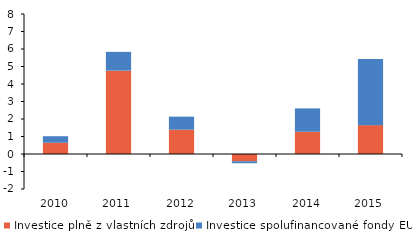
| Category | Investice plně z vlastních zdrojů | Investice spolufinancované fondy EU |
|---|---|---|
| 2010.0 | 0.642 | 0.374 |
| 2011.0 | 4.763 | 1.074 |
| 2012.0 | 1.388 | 0.746 |
| 2013.0 | -0.412 | -0.116 |
| 2014.0 | 1.271 | 1.335 |
| 2015.0 | 1.65 | 3.781 |